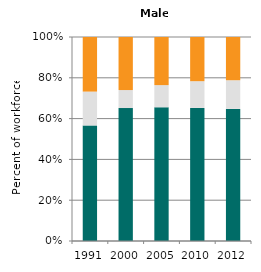
| Category | Agriculture | Industry | Services |
|---|---|---|---|
| 1991.0 | 56.66 | 16.58 | 26.761 |
| 2000.0 | 65.178 | 8.813 | 26.009 |
| 2005.0 | 65.55 | 10.857 | 23.593 |
| 2010.0 | 65.234 | 13.099 | 21.667 |
| 2012.0 | 64.755 | 14.054 | 21.191 |